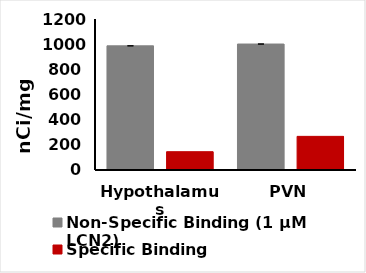
| Category | Non-Specific Binding (1 µM LCN2) | Specific Binding  |
|---|---|---|
| Hypothalamus | 986.7 | 145.45 |
| PVN | 1001.04 | 267.28 |